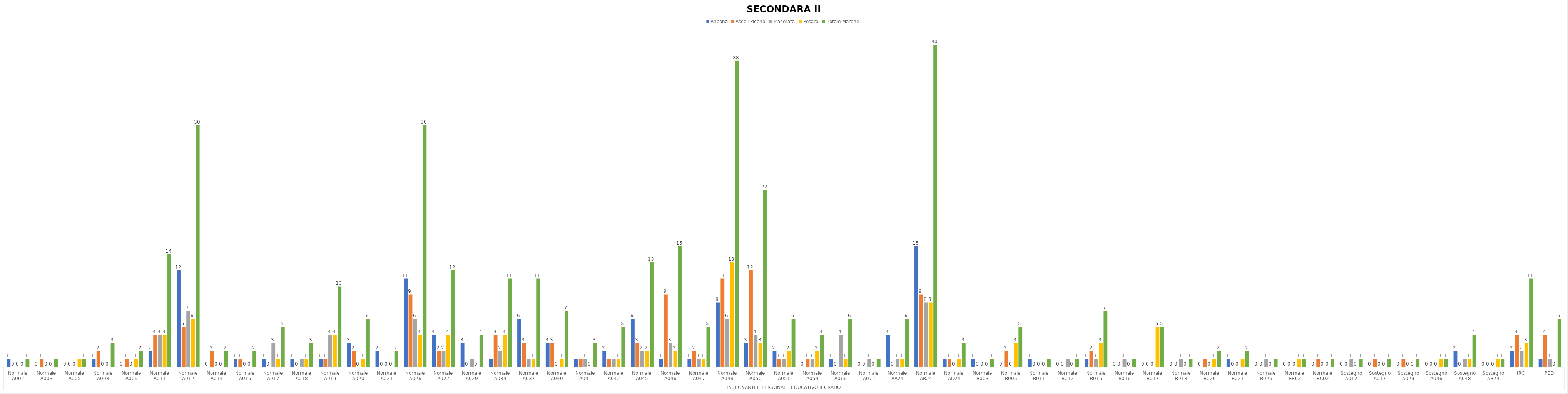
| Category | Ancona | Ascoli Piceno | Macerata | Pesaro | Totale Marche |
|---|---|---|---|---|---|
| 0 | 1 | 0 | 0 | 0 | 1 |
| 1 | 0 | 1 | 0 | 0 | 1 |
| 2 | 0 | 0 | 0 | 1 | 1 |
| 3 | 1 | 2 | 0 | 0 | 3 |
| 4 | 0 | 1 | 0 | 1 | 2 |
| 5 | 2 | 4 | 4 | 4 | 14 |
| 6 | 12 | 5 | 7 | 6 | 30 |
| 7 | 0 | 2 | 0 | 0 | 2 |
| 8 | 1 | 1 | 0 | 0 | 2 |
| 9 | 1 | 0 | 3 | 1 | 5 |
| 10 | 1 | 0 | 1 | 1 | 3 |
| 11 | 1 | 1 | 4 | 4 | 10 |
| 12 | 3 | 2 | 0 | 1 | 6 |
| 13 | 2 | 0 | 0 | 0 | 2 |
| 14 | 11 | 9 | 6 | 4 | 30 |
| 15 | 4 | 2 | 2 | 4 | 12 |
| 16 | 3 | 0 | 1 | 0 | 4 |
| 17 | 1 | 4 | 2 | 4 | 11 |
| 18 | 6 | 3 | 1 | 1 | 11 |
| 19 | 3 | 3 | 0 | 1 | 7 |
| 20 | 1 | 1 | 1 | 0 | 3 |
| 21 | 2 | 1 | 1 | 1 | 5 |
| 22 | 6 | 3 | 2 | 2 | 13 |
| 23 | 1 | 9 | 3 | 2 | 15 |
| 24 | 1 | 2 | 1 | 1 | 5 |
| 25 | 8 | 11 | 6 | 13 | 38 |
| 26 | 3 | 12 | 4 | 3 | 22 |
| 27 | 2 | 1 | 1 | 2 | 6 |
| 28 | 0 | 1 | 1 | 2 | 4 |
| 29 | 1 | 0 | 4 | 1 | 6 |
| 30 | 0 | 0 | 1 | 0 | 1 |
| 31 | 4 | 0 | 1 | 1 | 6 |
| 32 | 15 | 9 | 8 | 8 | 40 |
| 33 | 1 | 1 | 0 | 1 | 3 |
| 34 | 1 | 0 | 0 | 0 | 1 |
| 35 | 0 | 2 | 0 | 3 | 5 |
| 36 | 1 | 0 | 0 | 0 | 1 |
| 37 | 0 | 0 | 1 | 0 | 1 |
| 38 | 1 | 2 | 1 | 3 | 7 |
| 39 | 0 | 0 | 1 | 0 | 1 |
| 40 | 0 | 0 | 0 | 5 | 5 |
| 41 | 0 | 0 | 1 | 0 | 1 |
| 42 | 0 | 1 | 0 | 1 | 2 |
| 43 | 1 | 0 | 0 | 1 | 2 |
| 44 | 0 | 0 | 1 | 0 | 1 |
| 45 | 0 | 0 | 0 | 1 | 1 |
| 46 | 0 | 1 | 0 | 0 | 1 |
| 47 | 0 | 0 | 1 | 0 | 1 |
| 48 | 0 | 1 | 0 | 0 | 1 |
| 49 | 0 | 1 | 0 | 0 | 1 |
| 50 | 0 | 0 | 0 | 1 | 1 |
| 51 | 2 | 0 | 1 | 1 | 4 |
| 52 | 0 | 0 | 0 | 1 | 1 |
| 53 | 2 | 4 | 2 | 3 | 11 |
| 54 | 1 | 4 | 1 | 0 | 6 |